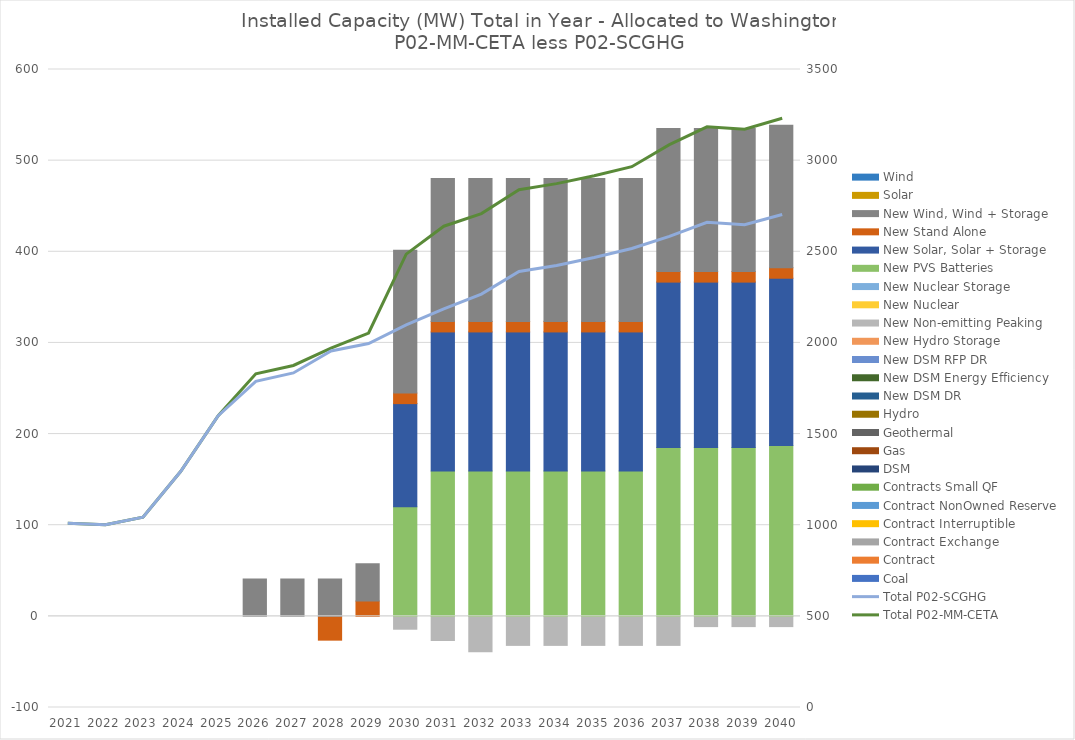
| Category | Coal | Contract | Contract Exchange | Contract Interruptible | Contract NonOwned Reserve | Contracts Small QF | DSM | Gas | Geothermal | Hydro | New DSM DR | New DSM Energy Efficiency | New DSM RFP DR | New Hydro Storage | New Non-emitting Peaking | New Nuclear | New Nuclear Storage | New PVS Batteries | New Solar, Solar + Storage | New Stand Alone | New Wind, Wind + Storage | Solar | Wind |
|---|---|---|---|---|---|---|---|---|---|---|---|---|---|---|---|---|---|---|---|---|---|---|---|
| 2021.0 | 0 | 0 | 0 | 0 | 0 | 0 | 0 | 0 | 0 | 0 | 0 | 0 | 0 | 0 | 0 | 0 | 0 | 0 | 0 | 0 | 0 | 0 | 0 |
| 2022.0 | 0 | 0 | 0 | 0 | 0 | 0 | 0 | 0 | 0 | 0 | 0 | 0 | 0 | 0 | 0 | 0 | 0 | 0 | 0 | 0 | 0 | 0 | 0 |
| 2023.0 | 0 | 0 | 0 | 0 | 0 | 0 | 0 | 0 | 0 | 0 | 0 | 0 | 0 | 0 | 0 | 0 | 0 | 0 | 0 | 0 | 0 | 0 | 0 |
| 2024.0 | 0 | 0 | 0 | 0 | 0 | 0 | 0 | 0 | 0 | 0 | 0 | 0 | 0 | 0 | 0 | 0 | 0 | 0 | 0 | 0 | 0 | 0 | 0 |
| 2025.0 | 0 | 0 | 0 | 0 | 0 | 0 | 0 | 0 | 0 | 0 | 0 | 0 | 0 | 0 | 0 | 0 | 0 | 0 | 0 | 0 | 0 | 0 | 0 |
| 2026.0 | 0 | 0 | 0 | 0 | 0 | 0 | 0 | 0 | 0 | 0 | 0 | 0 | 0 | 0 | 0 | 0 | 0 | 0 | 0 | 0 | 41.033 | 0 | 0 |
| 2027.0 | 0 | 0 | 0 | 0 | 0 | 0 | 0 | 0 | 0 | 0 | 0 | 0 | 0 | 0 | 0 | 0 | 0 | 0 | 0 | 0 | 41.033 | 0 | 0 |
| 2028.0 | 0 | 0 | 0 | 0 | 0 | 0 | 0 | 0 | 0 | 0 | 0 | 0 | 0 | 0 | 0 | 0 | 0 | 0 | 0 | -26.108 | 41.033 | 0 | 0 |
| 2029.0 | 0 | 0 | 0 | 0 | 0 | 0 | 0 | 0 | 0 | 0 | 0 | 0 | 0 | 0 | 0 | 0 | 0 | 0 | 0 | 16.758 | 41.033 | 0 | 0 |
| 2030.0 | 0 | 0 | 0 | 0 | 0 | 0 | 0 | 0 | 0 | 0 | 0 | 0 | 0 | 0 | -14.113 | 0 | 0 | 120.128 | 113.281 | 11.553 | 156.855 | 0 | 0 |
| 2031.0 | 0 | 0 | 0 | 0 | 0 | 0 | 0 | 0 | 0 | 0 | 0 | 0 | 0 | 0 | -26.521 | 0 | 0 | 159.457 | 152.61 | 11.553 | 156.855 | 0 | 0 |
| 2032.0 | 0 | 0 | 0 | 0 | 0 | 0 | 0 | 0 | 0 | 0 | 0 | 0 | 0 | 0 | -38.828 | 0 | 0 | 159.457 | 152.61 | 11.553 | 156.855 | 0 | 0 |
| 2033.0 | 0 | 0 | 0 | 0 | 0 | 0 | 0 | 0 | 0 | 0 | 0 | 0 | 0 | 0 | -31.858 | 0 | 0 | 159.457 | 152.61 | 11.553 | 156.855 | 0 | 0 |
| 2034.0 | 0 | 0 | 0 | 0 | 0 | 0 | 0 | 0 | 0 | 0 | 0 | 0 | 0 | 0 | -31.858 | 0 | 0 | 159.457 | 152.61 | 11.553 | 156.855 | 0 | 0 |
| 2035.0 | 0 | 0 | 0 | 0 | 0 | 0 | 0 | 0 | 0 | 0 | 0 | 0 | 0 | 0 | -31.858 | 0 | 0 | 159.457 | 152.61 | 11.553 | 156.855 | 0 | 0 |
| 2036.0 | 0 | 0 | 0 | 0 | 0 | 0 | 0 | 0 | 0 | 0 | 0 | 0 | 0 | 0 | -31.858 | 0 | 0 | 159.457 | 152.61 | 11.553 | 156.855 | 0 | 0 |
| 2037.0 | 0 | 0 | 0 | 0 | 0 | 0 | 0 | 0 | 0 | 0 | 0 | 0 | 0 | 0 | -31.858 | 0 | 0 | 185.368 | 181.375 | 11.553 | 156.855 | 0 | 0 |
| 2038.0 | 0 | 0 | 0 | 0 | 0 | 0 | 0 | 0 | 0 | 0 | 0 | 0 | 0 | 0 | -11.253 | 0 | 0 | 185.368 | 181.375 | 11.553 | 156.855 | 0 | 0 |
| 2039.0 | 0 | 0 | 0 | 0 | 0 | 0 | 0 | 0 | 0 | 0 | 0 | 0 | 0 | 0 | -11.253 | 0 | 0 | 185.368 | 181.375 | 11.553 | 156.855 | 0 | 0 |
| 2040.0 | 0 | 0 | 0 | 0 | 0 | 0 | 0 | 0 | 0 | 0 | 0 | 0 | 0 | 0 | -11.253 | 0 | 0 | 187.494 | 183.501 | 11.553 | 156.156 | 0 | 0 |